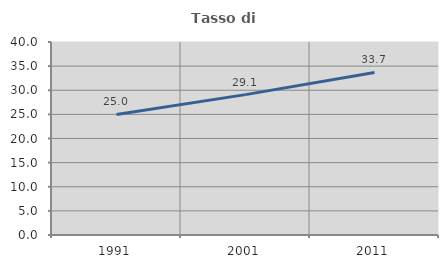
| Category | Tasso di occupazione   |
|---|---|
| 1991.0 | 24.978 |
| 2001.0 | 29.093 |
| 2011.0 | 33.686 |